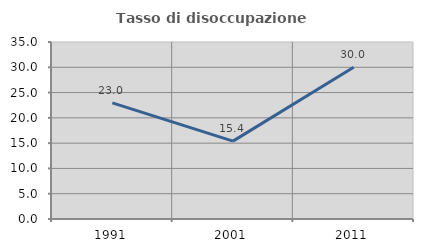
| Category | Tasso di disoccupazione giovanile  |
|---|---|
| 1991.0 | 22.967 |
| 2001.0 | 15.395 |
| 2011.0 | 30.014 |